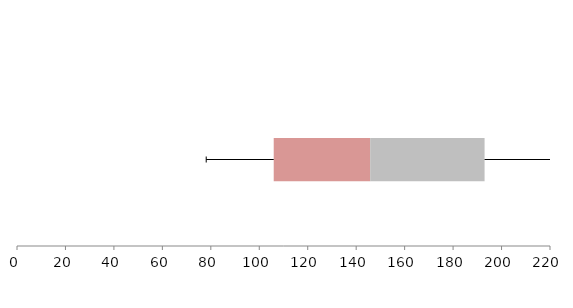
| Category | Series 1 | Series 2 | Series 3 |
|---|---|---|---|
| 0 | 105.963 | 39.812 | 47.222 |